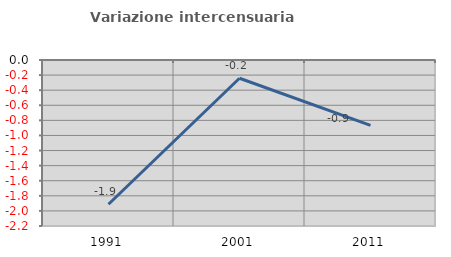
| Category | Variazione intercensuaria annua |
|---|---|
| 1991.0 | -1.912 |
| 2001.0 | -0.242 |
| 2011.0 | -0.866 |